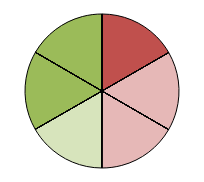
| Category | Series 2 | Series 3 | Series 0 | Series 1 |
|---|---|---|---|---|
| + + | 0 | 0 | 0 | 0 |
| + | 0 | 0 | 0 | 0 |
| o | 0 | 0 | 0 | 0 |
| - | 0 | 1 | 1 | 1 |
| - - | 1 | 0 | 0 | 0 |
| + + | 0 | 0 | 0 | 0 |
| + | 0 | 0 | 0 | 0 |
| o | 0 | 0 | 0 | 0 |
| - | 1 | 1 | 1 | 1 |
| - - | 0 | 0 | 0 | 0 |
| + + | 0 | 0 | 0 | 0 |
| + | 0 | 0 | 0 | 0 |
| o | 0 | 0 | 0 | 0 |
| - | 1 | 1 | 1 | 1 |
| - - | 0 | 0 | 0 | 0 |
| + + | 0 | 0 | 0 | 0 |
| + | 1 | 0 | 0 | 0 |
| o | 0 | 0 | 0 | 0 |
| - | 0 | 1 | 1 | 1 |
| - - | 0 | 0 | 0 | 0 |
| * * | 1 | 1 | 1 | 1 |
| * | 0 | 0 | 0 | 0 |
| o | 0 | 0 | 0 | 0 |
| * * | 0 | 0 | 0 | 0 |
| * | 0 | 1 | 1 | 1 |
| o | 1 | 0 | 0 | 0 |